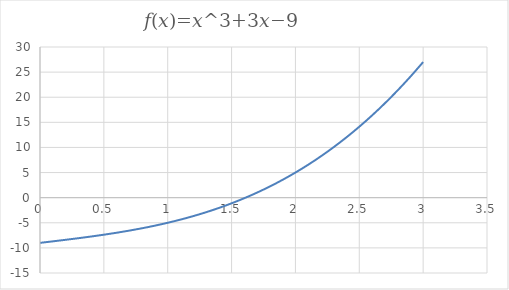
| Category | Series 0 |
|---|---|
| 0.0 | -9 |
| 0.1 | -8.699 |
| 0.2 | -8.392 |
| 0.3 | -8.073 |
| 0.4 | -7.736 |
| 0.5 | -7.375 |
| 0.6 | -6.984 |
| 0.7 | -6.557 |
| 0.8 | -6.088 |
| 0.9 | -5.571 |
| 1.0 | -5 |
| 1.1 | -4.369 |
| 1.2 | -3.672 |
| 1.3 | -2.903 |
| 1.4 | -2.056 |
| 1.5 | -1.125 |
| 1.6 | -0.104 |
| 1.7 | 1.013 |
| 1.8 | 2.232 |
| 1.9 | 3.559 |
| 2.0 | 5 |
| 2.1 | 6.561 |
| 2.2 | 8.248 |
| 2.3 | 10.067 |
| 2.4 | 12.024 |
| 2.5 | 14.125 |
| 2.6 | 16.376 |
| 2.7 | 18.783 |
| 2.8 | 21.352 |
| 2.9 | 24.089 |
| 3.0 | 27 |